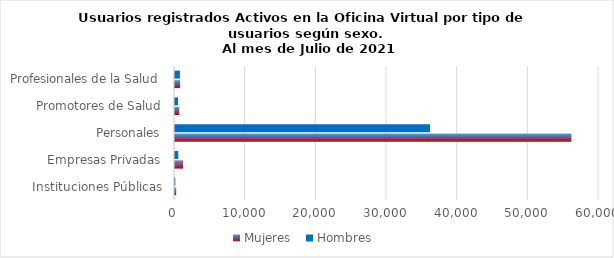
| Category | Mujeres | Hombres |
|---|---|---|
| Instituciones Públicas | 166 | 45 |
| Empresas Privadas | 1153 | 471 |
| Personales | 56097 | 36076 |
| Promotores de Salud | 607 | 433 |
| Profesionales de la Salud | 718 | 700 |